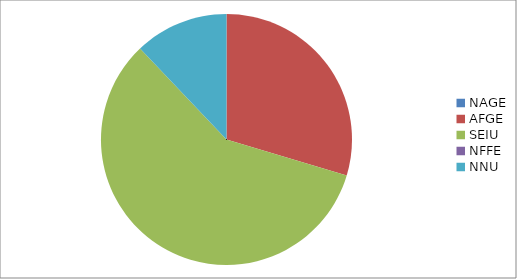
| Category | Series 0 |
|---|---|
| NAGE | 0 |
| AFGE | 1610 |
| SEIU | 3166 |
| NFFE | 0 |
| NNU | 657 |